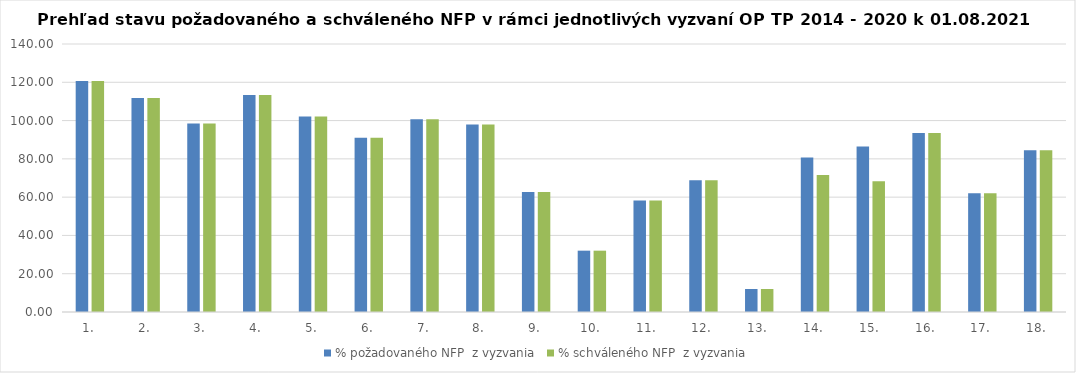
| Category | % požadovaného NFP  z vyzvania | % schváleného NFP  z vyzvania |
|---|---|---|
| 1. | 120.662 | 120.662 |
| 2. | 111.83 | 111.83 |
| 3. | 98.465 | 98.465 |
| 4. | 113.295 | 113.295 |
| 5. | 102.19 | 102.19 |
| 6. | 91.016 | 91.016 |
| 7. | 100.637 | 100.637 |
| 8. | 97.989 | 97.989 |
| 9. | 62.721 | 62.721 |
| 10. | 32.038 | 32.038 |
| 11. | 58.283 | 58.283 |
| 12. | 68.88 | 68.88 |
| 13. | 12.008 | 12.008 |
| 14. | 80.704 | 71.58 |
| 15. | 86.515 | 68.356 |
| 16. | 93.51 | 93.51 |
| 17. | 61.969 | 61.969 |
| 18. | 84.514 | 84.514 |